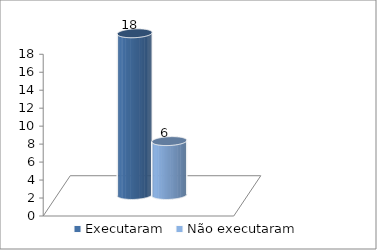
| Category | Executaram | Não executaram |
|---|---|---|
| 0 | 18 | 6 |